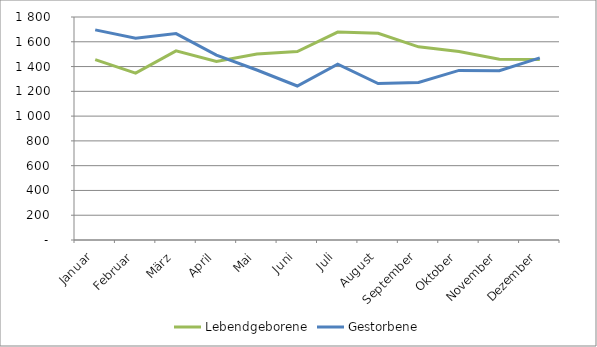
| Category | Lebendgeborene | Gestorbene |
|---|---|---|
| Januar | 1456 | 1696 |
| Februar | 1347 | 1628 |
| März | 1527 | 1666 |
| April | 1442 | 1493 |
| Mai | 1501 | 1372 |
| Juni | 1521 | 1243 |
| Juli | 1678 | 1420 |
| August | 1669 | 1263 |
| September | 1559 | 1272 |
| Oktober | 1522 | 1369 |
| November | 1459 | 1366 |
| Dezember | 1456 | 1470 |